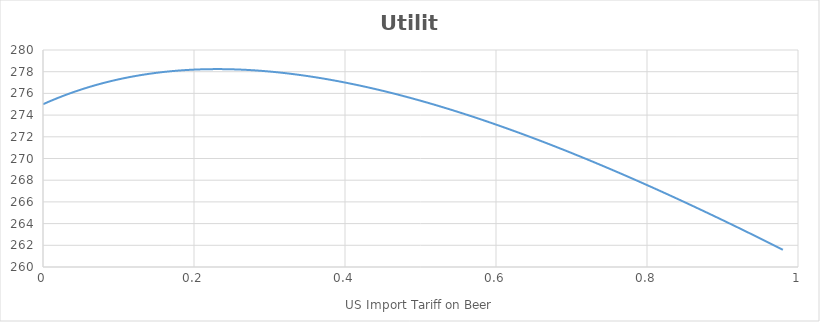
| Category | Series 0 |
|---|---|
| 0.0 | 275 |
| 0.01 | 275.303 |
| 0.02 | 275.589 |
| 0.03 | 275.858 |
| 0.04 | 276.11 |
| 0.05 | 276.345 |
| 0.060000000000000005 | 276.565 |
| 0.07 | 276.769 |
| 0.08 | 276.958 |
| 0.09 | 277.133 |
| 0.09999999999999999 | 277.293 |
| 0.10999999999999999 | 277.44 |
| 0.11999999999999998 | 277.573 |
| 0.12999999999999998 | 277.693 |
| 0.13999999999999999 | 277.8 |
| 0.15 | 277.894 |
| 0.16 | 277.977 |
| 0.17 | 278.048 |
| 0.18000000000000002 | 278.107 |
| 0.19000000000000003 | 278.155 |
| 0.20000000000000004 | 278.192 |
| 0.21000000000000005 | 278.218 |
| 0.22000000000000006 | 278.234 |
| 0.23000000000000007 | 278.24 |
| 0.24000000000000007 | 278.236 |
| 0.25000000000000006 | 278.222 |
| 0.26000000000000006 | 278.199 |
| 0.2700000000000001 | 278.167 |
| 0.2800000000000001 | 278.125 |
| 0.2900000000000001 | 278.075 |
| 0.3000000000000001 | 278.016 |
| 0.3100000000000001 | 277.949 |
| 0.3200000000000001 | 277.874 |
| 0.3300000000000001 | 277.791 |
| 0.34000000000000014 | 277.7 |
| 0.35000000000000014 | 277.602 |
| 0.36000000000000015 | 277.496 |
| 0.37000000000000016 | 277.383 |
| 0.38000000000000017 | 277.263 |
| 0.3900000000000002 | 277.136 |
| 0.4000000000000002 | 277.003 |
| 0.4100000000000002 | 276.862 |
| 0.4200000000000002 | 276.716 |
| 0.4300000000000002 | 276.563 |
| 0.4400000000000002 | 276.403 |
| 0.45000000000000023 | 276.238 |
| 0.46000000000000024 | 276.067 |
| 0.47000000000000025 | 275.891 |
| 0.48000000000000026 | 275.708 |
| 0.49000000000000027 | 275.521 |
| 0.5000000000000002 | 275.328 |
| 0.5100000000000002 | 275.129 |
| 0.5200000000000002 | 274.926 |
| 0.5300000000000002 | 274.717 |
| 0.5400000000000003 | 274.504 |
| 0.5500000000000003 | 274.286 |
| 0.5600000000000003 | 274.063 |
| 0.5700000000000003 | 273.836 |
| 0.5800000000000003 | 273.604 |
| 0.5900000000000003 | 273.368 |
| 0.6000000000000003 | 273.128 |
| 0.6100000000000003 | 272.883 |
| 0.6200000000000003 | 272.634 |
| 0.6300000000000003 | 272.382 |
| 0.6400000000000003 | 272.125 |
| 0.6500000000000004 | 271.865 |
| 0.6600000000000004 | 271.6 |
| 0.6700000000000004 | 271.333 |
| 0.6800000000000004 | 271.061 |
| 0.6900000000000004 | 270.786 |
| 0.7000000000000004 | 270.508 |
| 0.7100000000000004 | 270.226 |
| 0.7200000000000004 | 269.942 |
| 0.7300000000000004 | 269.653 |
| 0.7400000000000004 | 269.362 |
| 0.7500000000000004 | 269.068 |
| 0.7600000000000005 | 268.77 |
| 0.7700000000000005 | 268.47 |
| 0.7800000000000005 | 268.167 |
| 0.7900000000000005 | 267.861 |
| 0.8000000000000005 | 267.552 |
| 0.8100000000000005 | 267.241 |
| 0.8200000000000005 | 266.927 |
| 0.8300000000000005 | 266.61 |
| 0.8400000000000005 | 266.291 |
| 0.8500000000000005 | 265.969 |
| 0.8600000000000005 | 265.645 |
| 0.8700000000000006 | 265.319 |
| 0.8800000000000006 | 264.99 |
| 0.8900000000000006 | 264.659 |
| 0.9000000000000006 | 264.326 |
| 0.9100000000000006 | 263.99 |
| 0.9200000000000006 | 263.653 |
| 0.9300000000000006 | 263.313 |
| 0.9400000000000006 | 262.972 |
| 0.9500000000000006 | 262.628 |
| 0.9600000000000006 | 262.283 |
| 0.9700000000000006 | 261.935 |
| 0.9800000000000006 | 261.586 |